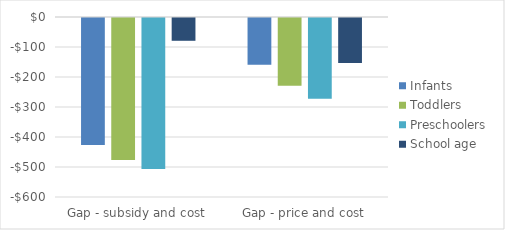
| Category | Infants | Toddlers | Preschoolers | School age |
|---|---|---|---|---|
| Gap - subsidy and cost | -423.552 | -472.952 | -503.286 | -75.937 |
| Gap - price and cost | -155.536 | -225.952 | -269.286 | -149.603 |